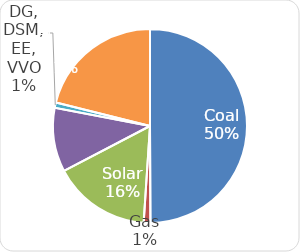
| Category | Series 0 |
|---|---|
| Coal | 3037.703 |
| Gas | 67.797 |
| Solar | 991.864 |
| Wind | 648.24 |
| DG, DSM, EE, VVO | 54.5 |
| Mrkt Energy | 1283.97 |